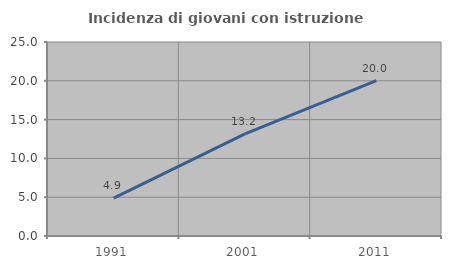
| Category | Incidenza di giovani con istruzione universitaria |
|---|---|
| 1991.0 | 4.868 |
| 2001.0 | 13.167 |
| 2011.0 | 20.029 |